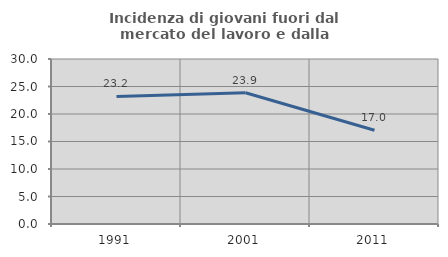
| Category | Incidenza di giovani fuori dal mercato del lavoro e dalla formazione  |
|---|---|
| 1991.0 | 23.198 |
| 2001.0 | 23.853 |
| 2011.0 | 17.037 |